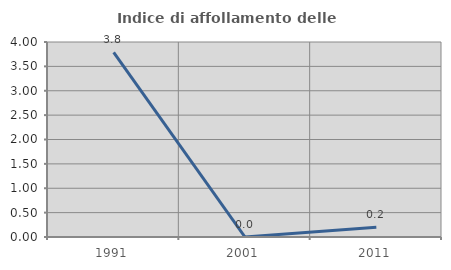
| Category | Indice di affollamento delle abitazioni  |
|---|---|
| 1991.0 | 3.788 |
| 2001.0 | 0 |
| 2011.0 | 0.201 |